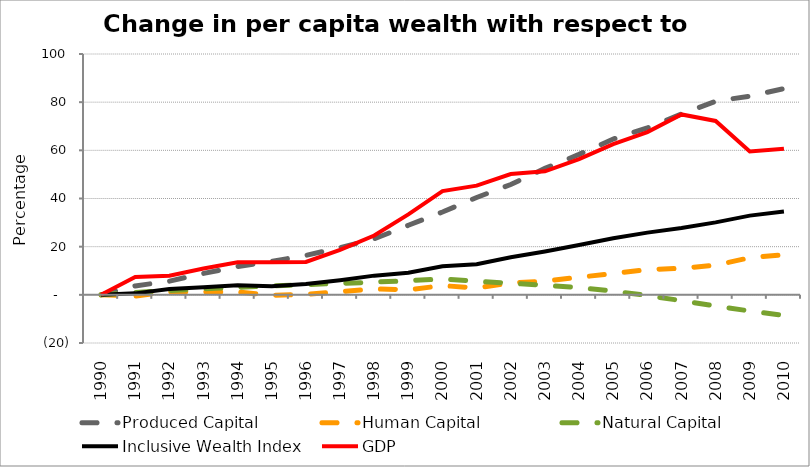
| Category | Produced Capital  | Human Capital | Natural Capital | Inclusive Wealth Index | GDP |
|---|---|---|---|---|---|
| 1990.0 | 0 | 0 | 0 | 0 | 0 |
| 1991.0 | 3.705 | -0.501 | 0.977 | 0.611 | 7.368 |
| 1992.0 | 5.681 | 1.238 | 1.803 | 2.408 | 7.917 |
| 1993.0 | 8.878 | 1.126 | 2.51 | 3.169 | 10.917 |
| 1994.0 | 11.747 | 1.153 | 3.14 | 3.945 | 13.543 |
| 1995.0 | 13.925 | -0.19 | 3.729 | 3.537 | 13.553 |
| 1996.0 | 16.38 | 0.244 | 4.267 | 4.502 | 13.644 |
| 1997.0 | 19.587 | 1.262 | 4.76 | 6.091 | 18.677 |
| 1998.0 | 23.229 | 2.518 | 5.268 | 7.969 | 24.637 |
| 1999.0 | 28.882 | 2.08 | 5.867 | 9.137 | 33.423 |
| 2000.0 | 34.399 | 3.831 | 6.595 | 11.87 | 43.08 |
| 2001.0 | 40.422 | 2.87 | 5.621 | 12.742 | 45.341 |
| 2002.0 | 45.825 | 4.896 | 4.816 | 15.638 | 50.155 |
| 2003.0 | 52.502 | 5.72 | 4.004 | 17.989 | 51.298 |
| 2004.0 | 58.322 | 7.293 | 2.955 | 20.662 | 56.359 |
| 2005.0 | 64.701 | 8.868 | 1.535 | 23.481 | 62.574 |
| 2006.0 | 69.33 | 10.443 | -0.295 | 25.838 | 67.583 |
| 2007.0 | 75.079 | 11.034 | -2.418 | 27.768 | 74.903 |
| 2008.0 | 80.376 | 12.311 | -4.636 | 30.08 | 72.215 |
| 2009.0 | 82.503 | 15.4 | -6.717 | 32.887 | 59.532 |
| 2010.0 | 85.626 | 16.631 | -8.52 | 34.597 | 60.637 |